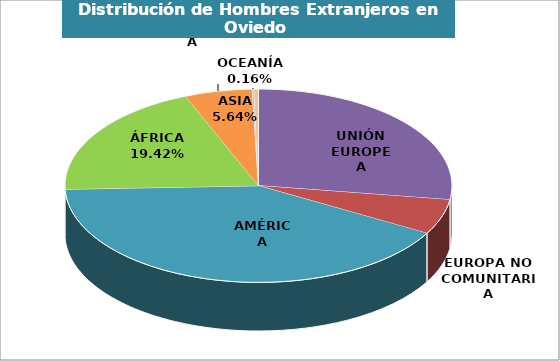
| Category | Hombres |
|---|---|
| UNIÓN EUROPEA | 1886 |
| EUROPA NO COMUNITARIA | 405 |
| AMÉRICA | 2843 |
| ÁFRICA | 1340 |
| ASIA | 389 |
| OCEANÍA | 11 |
| APÁTRIDA | 25 |